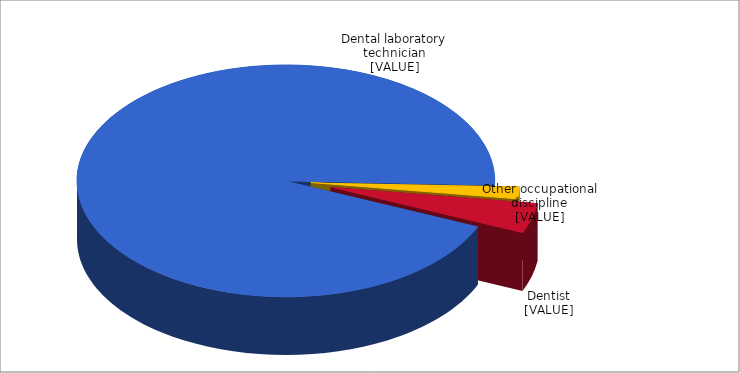
| Category | Series 0 |
|---|---|
| Other | 0.017 |
| Dentist | 0.042 |
| Dental laboratory technician | 0.942 |